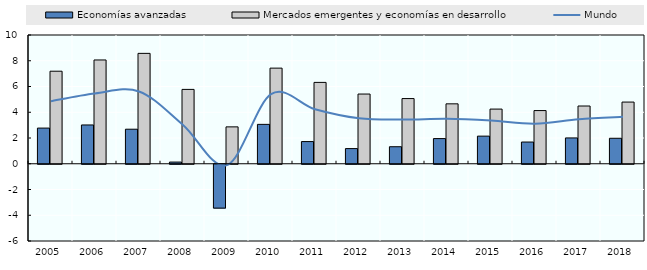
| Category | Economías avanzadas | Mercados emergentes y economías en desarrollo |
|---|---|---|
| 2005.0 | 2.77 | 7.187 |
| 2006.0 | 3.013 | 8.061 |
| 2007.0 | 2.683 | 8.573 |
| 2008.0 | 0.131 | 5.775 |
| 2009.0 | -3.407 | 2.865 |
| 2010.0 | 3.059 | 7.426 |
| 2011.0 | 1.723 | 6.319 |
| 2012.0 | 1.178 | 5.414 |
| 2013.0 | 1.322 | 5.063 |
| 2014.0 | 1.954 | 4.654 |
| 2015.0 | 2.145 | 4.246 |
| 2016.0 | 1.686 | 4.131 |
| 2017.0 | 2.005 | 4.485 |
| 2018.0 | 1.979 | 4.791 |